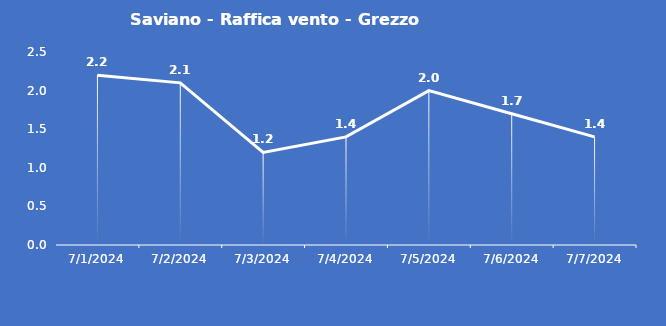
| Category | Saviano - Raffica vento - Grezzo (m/s) |
|---|---|
| 7/1/24 | 2.2 |
| 7/2/24 | 2.1 |
| 7/3/24 | 1.2 |
| 7/4/24 | 1.4 |
| 7/5/24 | 2 |
| 7/6/24 | 1.7 |
| 7/7/24 | 1.4 |